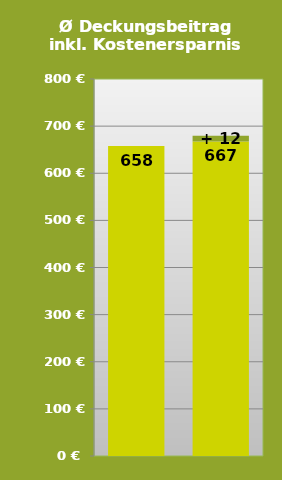
| Category | Ø Deckungsbeitrag inkl. Kostenersparnis / ha | Kosteneffekt |
|---|---|---|
| 0 | 657.876 | 0 |
| 1 | 667.405 | 12.072 |